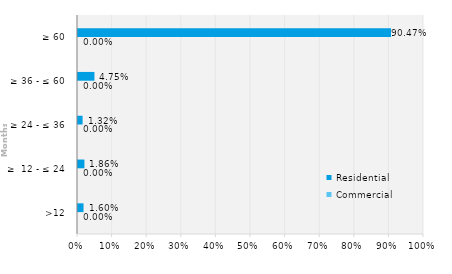
| Category | Commercial | Residential |
|---|---|---|
| >12 | 0 | 0.016 |
| ≥  12 - ≤ 24 | 0 | 0.019 |
| ≥ 24 - ≤ 36 | 0 | 0.013 |
| ≥ 36 - ≤ 60 | 0 | 0.048 |
| ≥ 60 | 0 | 0.905 |